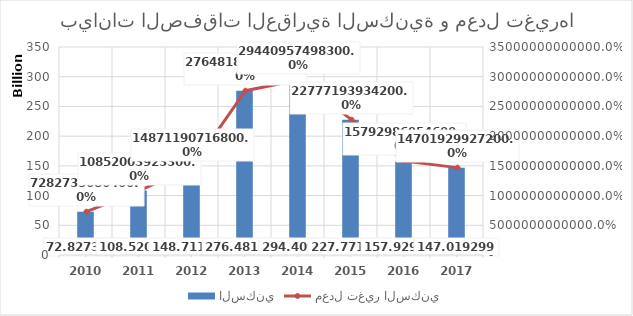
| Category | السكني |
|---|---|
| 2010 | 51957253136 |
| 2011 | 63999414404 |
| 2012 | 59821181862 |
| 2013 | 82228868218 |
| 2014 | 86427313866 |
| 2015 | 64965632232 |
| 2016 | 54104934514 |
| 2017 | 52038728556 |